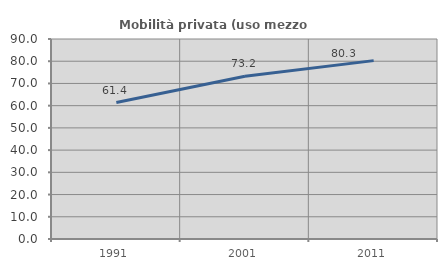
| Category | Mobilità privata (uso mezzo privato) |
|---|---|
| 1991.0 | 61.413 |
| 2001.0 | 73.247 |
| 2011.0 | 80.265 |